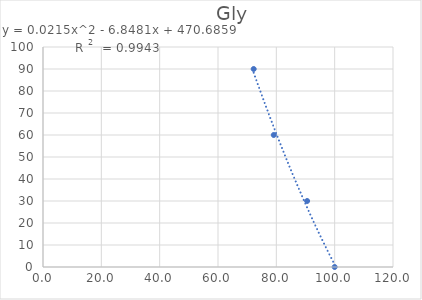
| Category | Time (minutes) |
|---|---|
| 100.0 | 0 |
| 90.55839999999999 | 30 |
| 79.11722999999999 | 60 |
| 72.23214599999999 | 90 |